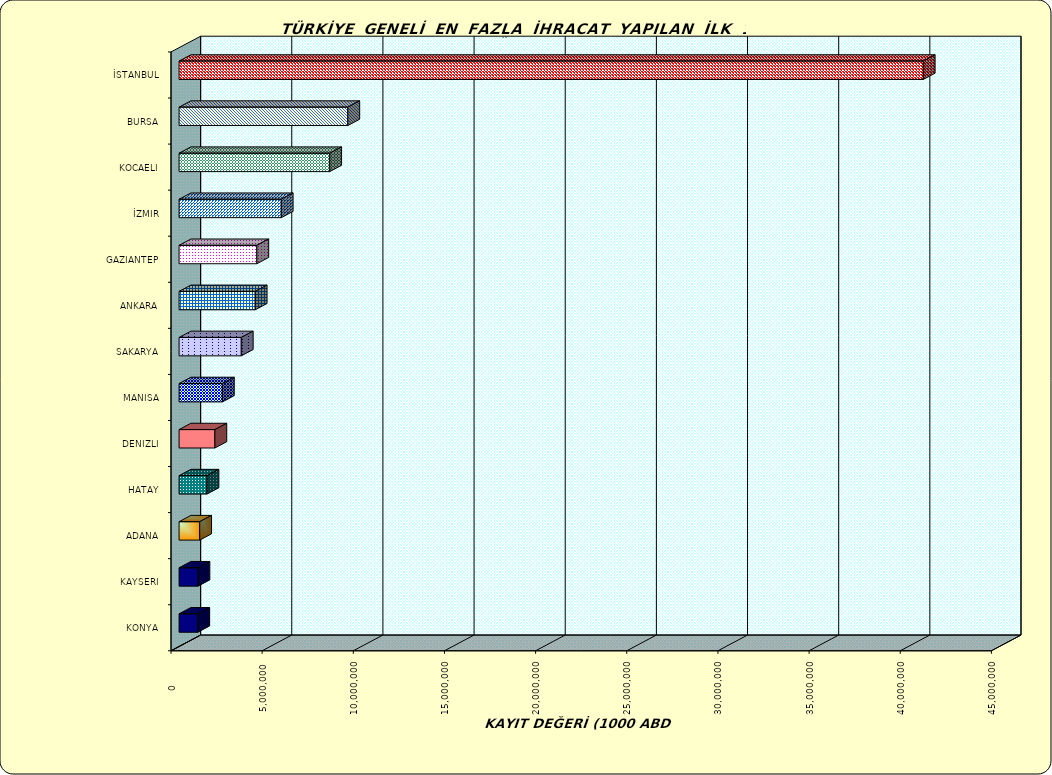
| Category | Series 0 |
|---|---|
| İSTANBUL | 40820459.882 |
| BURSA | 9257142.633 |
| KOCAELI | 8264090.793 |
| İZMIR | 5604686.418 |
| GAZIANTEP | 4266311.919 |
| ANKARA | 4176964.651 |
| SAKARYA | 3412592.304 |
| MANISA | 2375926.278 |
| DENIZLI | 1964734.518 |
| HATAY | 1533005.906 |
| ADANA | 1132049.339 |
| KAYSERI | 1037766.009 |
| KONYA | 1027499.291 |